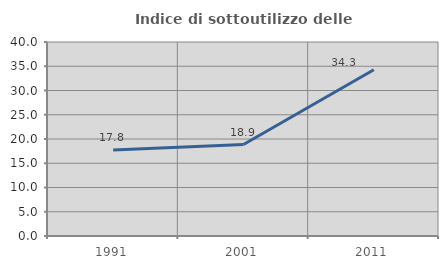
| Category | Indice di sottoutilizzo delle abitazioni  |
|---|---|
| 1991.0 | 17.751 |
| 2001.0 | 18.859 |
| 2011.0 | 34.286 |